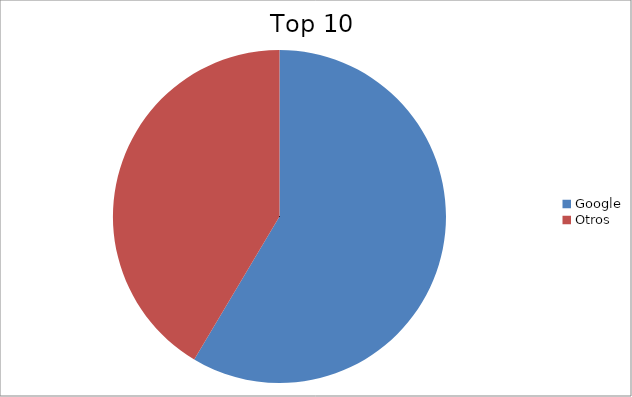
| Category | Series 0 |
|---|---|
| Google | 58.56 |
| Otros | 41.44 |